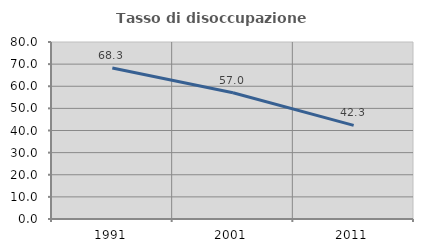
| Category | Tasso di disoccupazione giovanile  |
|---|---|
| 1991.0 | 68.263 |
| 2001.0 | 57.042 |
| 2011.0 | 42.308 |